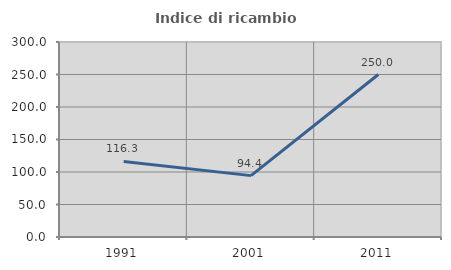
| Category | Indice di ricambio occupazionale  |
|---|---|
| 1991.0 | 116.312 |
| 2001.0 | 94.41 |
| 2011.0 | 250 |